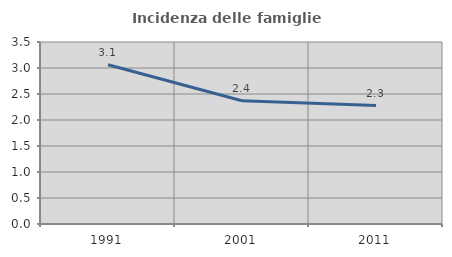
| Category | Incidenza delle famiglie numerose |
|---|---|
| 1991.0 | 3.064 |
| 2001.0 | 2.371 |
| 2011.0 | 2.278 |